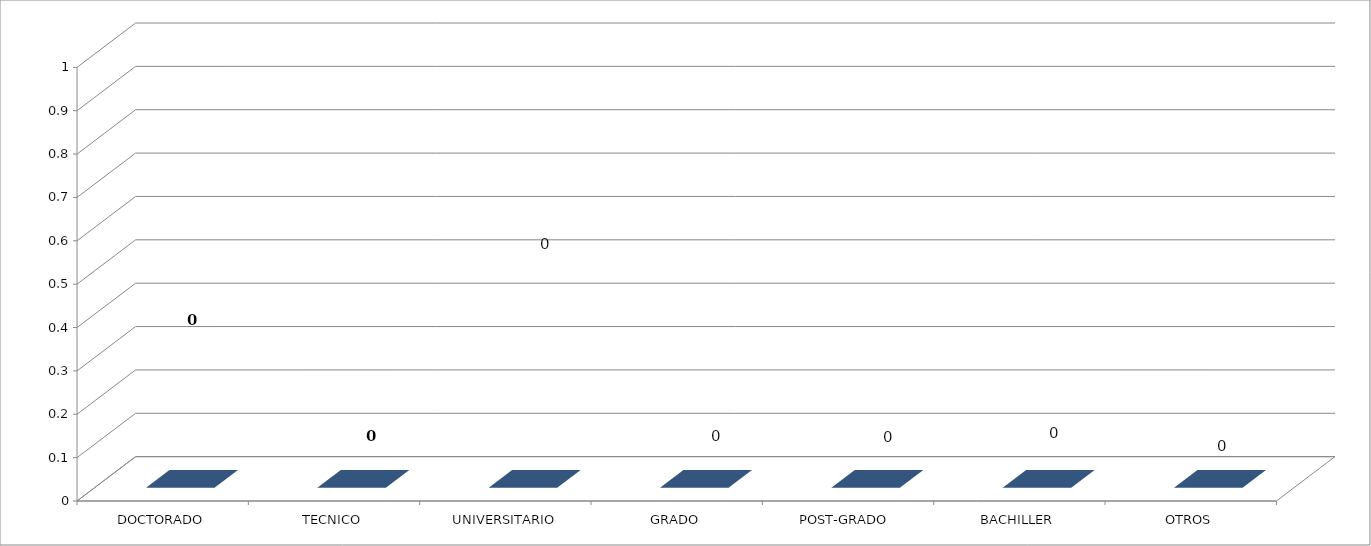
| Category | Series 0 |
|---|---|
| DOCTORADO | 0 |
| TECNICO | 0 |
| UNIVERSITARIO | 0 |
| GRADO | 0 |
| POST-GRADO  | 0 |
| BACHILLER | 0 |
| OTROS | 0 |